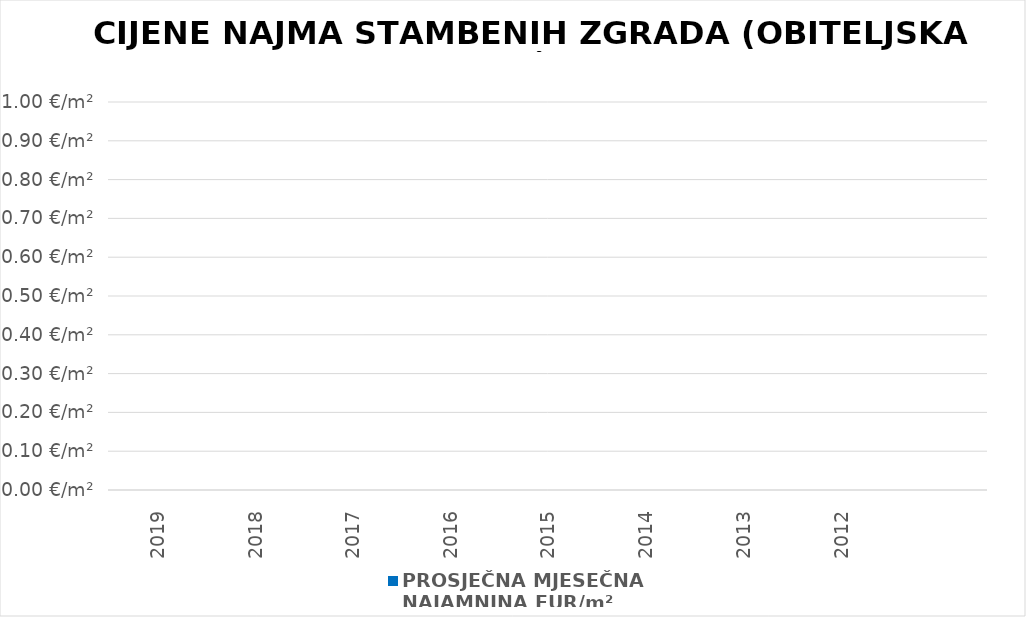
| Category | PROSJEČNA MJESEČNA 
NAJAMNINA EUR/m² |
|---|---|
| 2019 | 0 |
| 2018 | 0 |
| 2017 | 0 |
| 2016 | 0 |
| 2015 | 0 |
| 2014 | 0 |
| 2013 | 0 |
| 2012 | 0 |